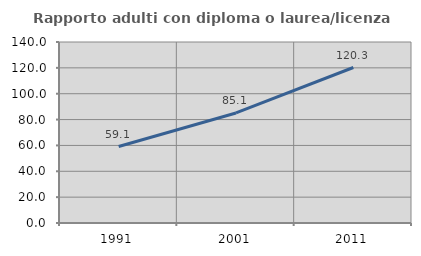
| Category | Rapporto adulti con diploma o laurea/licenza media  |
|---|---|
| 1991.0 | 59.14 |
| 2001.0 | 85.128 |
| 2011.0 | 120.26 |